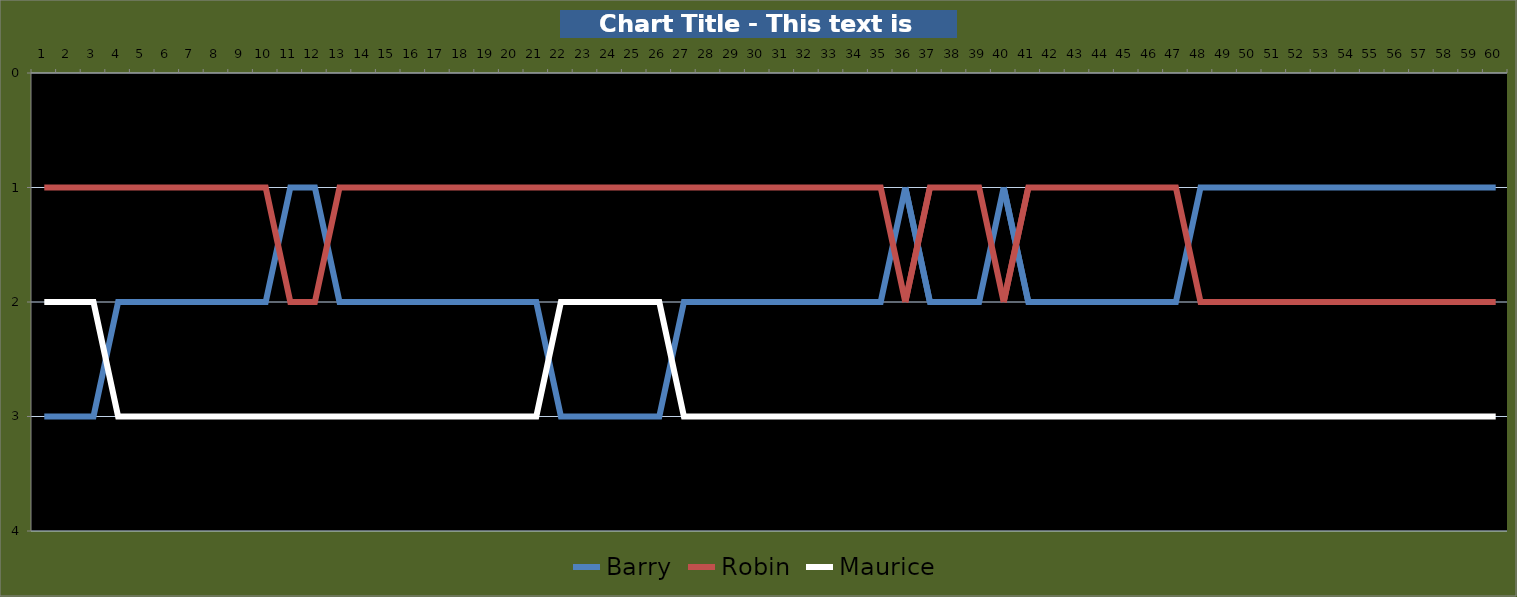
| Category | Barry | Robin | Maurice |
|---|---|---|---|
| 0 | 3 | 1 | 2 |
| 1 | 3 | 1 | 2 |
| 2 | 3 | 1 | 2 |
| 3 | 2 | 1 | 3 |
| 4 | 2 | 1 | 3 |
| 5 | 2 | 1 | 3 |
| 6 | 2 | 1 | 3 |
| 7 | 2 | 1 | 3 |
| 8 | 2 | 1 | 3 |
| 9 | 2 | 1 | 3 |
| 10 | 1 | 2 | 3 |
| 11 | 1 | 2 | 3 |
| 12 | 2 | 1 | 3 |
| 13 | 2 | 1 | 3 |
| 14 | 2 | 1 | 3 |
| 15 | 2 | 1 | 3 |
| 16 | 2 | 1 | 3 |
| 17 | 2 | 1 | 3 |
| 18 | 2 | 1 | 3 |
| 19 | 2 | 1 | 3 |
| 20 | 2 | 1 | 3 |
| 21 | 3 | 1 | 2 |
| 22 | 3 | 1 | 2 |
| 23 | 3 | 1 | 2 |
| 24 | 3 | 1 | 2 |
| 25 | 3 | 1 | 2 |
| 26 | 2 | 1 | 3 |
| 27 | 2 | 1 | 3 |
| 28 | 2 | 1 | 3 |
| 29 | 2 | 1 | 3 |
| 30 | 2 | 1 | 3 |
| 31 | 2 | 1 | 3 |
| 32 | 2 | 1 | 3 |
| 33 | 2 | 1 | 3 |
| 34 | 2 | 1 | 3 |
| 35 | 1 | 2 | 3 |
| 36 | 2 | 1 | 3 |
| 37 | 2 | 1 | 3 |
| 38 | 2 | 1 | 3 |
| 39 | 1 | 2 | 3 |
| 40 | 2 | 1 | 3 |
| 41 | 2 | 1 | 3 |
| 42 | 2 | 1 | 3 |
| 43 | 2 | 1 | 3 |
| 44 | 2 | 1 | 3 |
| 45 | 2 | 1 | 3 |
| 46 | 2 | 1 | 3 |
| 47 | 1 | 2 | 3 |
| 48 | 1 | 2 | 3 |
| 49 | 1 | 2 | 3 |
| 50 | 1 | 2 | 3 |
| 51 | 1 | 2 | 3 |
| 52 | 1 | 2 | 3 |
| 53 | 1 | 2 | 3 |
| 54 | 1 | 2 | 3 |
| 55 | 1 | 2 | 3 |
| 56 | 1 | 2 | 3 |
| 57 | 1 | 2 | 3 |
| 58 | 1 | 2 | 3 |
| 59 | 1 | 2 | 3 |